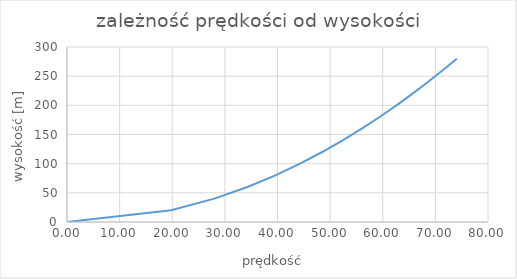
| Category | zależność prędkości od wysokości |
|---|---|
| 74.08103670980854 | 280 |
| 71.386273190299 | 260 |
| 68.58571279792899 | 240 |
| 65.66582063752801 | 220 |
| 62.609903369994115 | 200 |
| 59.396969619669996 | 180 |
| 56.0 | 160 |
| 52.38320341483518 | 140 |
| 48.49742261192856 | 120 |
| 44.271887242357316 | 100 |
| 39.59797974644666 | 80 |
| 34.292856398964496 | 60 |
| 28.0 | 40 |
| 19.79898987322333 | 20 |
| 0.0 | 0 |